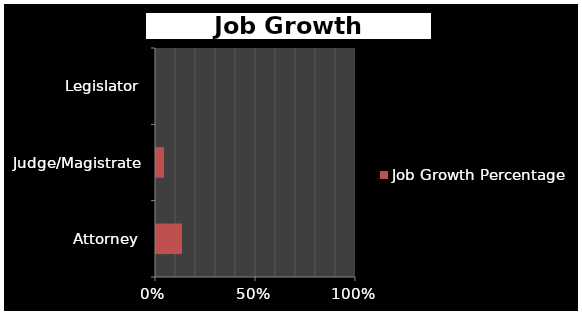
| Category | Job Growth Percentage |
|---|---|
| Attorney | 0.13 |
| Judge/Magistrate | 0.04 |
| Legislator | 0 |